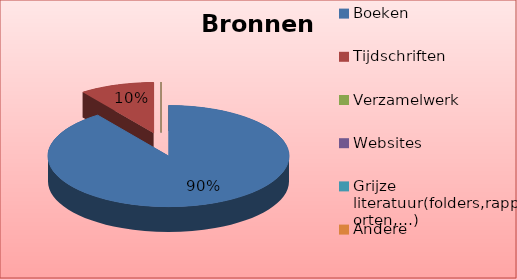
| Category | Aantal  |
|---|---|
| Boeken | 9 |
| Tijdschriften | 1 |
| Verzamelwerk  | 0 |
| Websites | 0 |
| Grijze literatuur(folders,rapporten,…) | 0 |
| Andere | 0 |